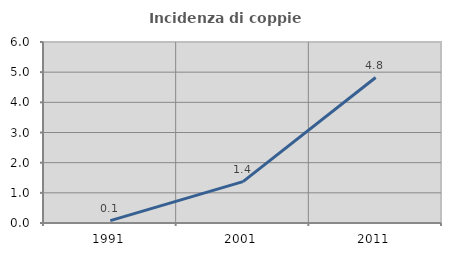
| Category | Incidenza di coppie miste |
|---|---|
| 1991.0 | 0.08 |
| 2001.0 | 1.37 |
| 2011.0 | 4.823 |